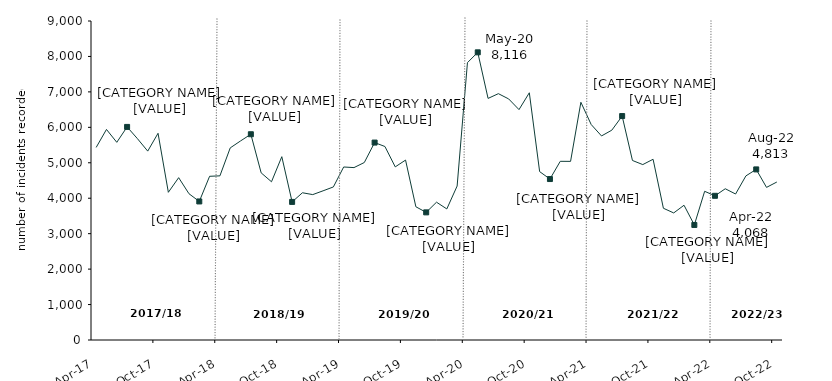
| Category | Series 0 |
|---|---|
| 2017-04-01 | 5433 |
| 2017-05-01 | 5941 |
| 2017-06-01 | 5577 |
| 2017-07-01 | 6012 |
| 2017-08-01 | 5681 |
| 2017-09-01 | 5329 |
| 2017-10-01 | 5832 |
| 2017-11-01 | 4167 |
| 2017-12-01 | 4580 |
| 2018-01-01 | 4127 |
| 2018-02-01 | 3909 |
| 2018-03-01 | 4619 |
| 2018-04-01 | 4631 |
| 2018-05-01 | 5420 |
| 2018-06-01 | 5616 |
| 2018-07-01 | 5805 |
| 2018-08-01 | 4716 |
| 2018-09-01 | 4464 |
| 2018-10-01 | 5172 |
| 2018-11-01 | 3896 |
| 2018-12-01 | 4154 |
| 2019-01-01 | 4102 |
| 2019-02-01 | 4209 |
| 2019-03-01 | 4318 |
| 2019-04-01 | 4881 |
| 2019-05-01 | 4864 |
| 2019-06-01 | 5007 |
| 2019-07-01 | 5570 |
| 2019-08-01 | 5459 |
| 2019-09-01 | 4884 |
| 2019-10-01 | 5076 |
| 2019-11-01 | 3759 |
| 2019-12-01 | 3601 |
| 2020-01-01 | 3888 |
| 2020-02-01 | 3698 |
| 2020-03-01 | 4344 |
| 2020-04-01 | 7825 |
| 2020-05-01 | 8116 |
| 2020-06-01 | 6816 |
| 2020-07-01 | 6950 |
| 2020-08-01 | 6801 |
| 2020-09-01 | 6500 |
| 2020-10-01 | 6975 |
| 2020-11-01 | 4751 |
| 2020-12-01 | 4541 |
| 2021-01-01 | 5041 |
| 2021-02-01 | 5040 |
| 2021-03-01 | 6707 |
| 2021-04-01 | 6079 |
| 2021-05-01 | 5757 |
| 2021-06-01 | 5920 |
| 2021-07-01 | 6318 |
| 2021-08-01 | 5065 |
| 2021-09-01 | 4949 |
| 2021-10-01 | 5099 |
| 2021-11-01 | 3717 |
| 2021-12-01 | 3585 |
| 2022-01-01 | 3802 |
| 2022-02-01 | 3246 |
| 2022-03-01 | 4195 |
| 2022-04-01 | 4068 |
| 2022-05-01 | 4267 |
| 2022-06-01 | 4119 |
| 2022-07-01 | 4630 |
| 2022-08-01 | 4813 |
| 2022-09-01 | 4306 |
| 2022-10-01 | 4457 |